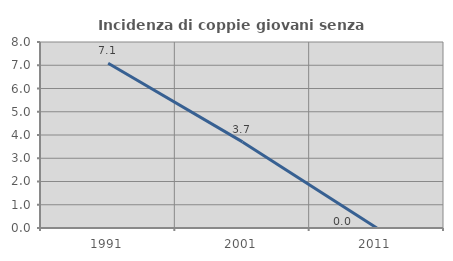
| Category | Incidenza di coppie giovani senza figli |
|---|---|
| 1991.0 | 7.087 |
| 2001.0 | 3.704 |
| 2011.0 | 0 |